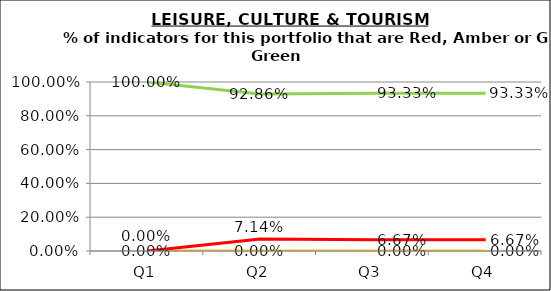
| Category | Green | Amber | Red |
|---|---|---|---|
| Q1 | 1 | 0 | 0 |
| Q2 | 0.929 | 0 | 0.071 |
| Q3 | 0.933 | 0 | 0.067 |
| Q4 | 0.933 | 0 | 0.067 |